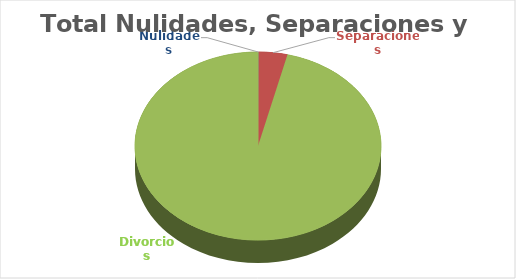
| Category | Series 0 |
|---|---|
| Nulidades | 39 |
| Separaciones | 3210 |
| Divorcios | 81302 |